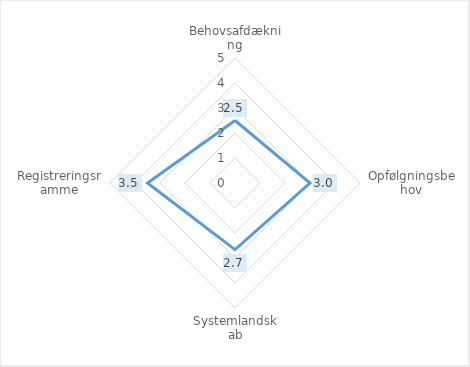
| Category | Series 0 |
|---|---|
| Behovsafdækning | 2.5 |
| Opfølgningsbehov | 3 |
| Systemlandskab | 2.667 |
| Registreringsramme | 3.5 |